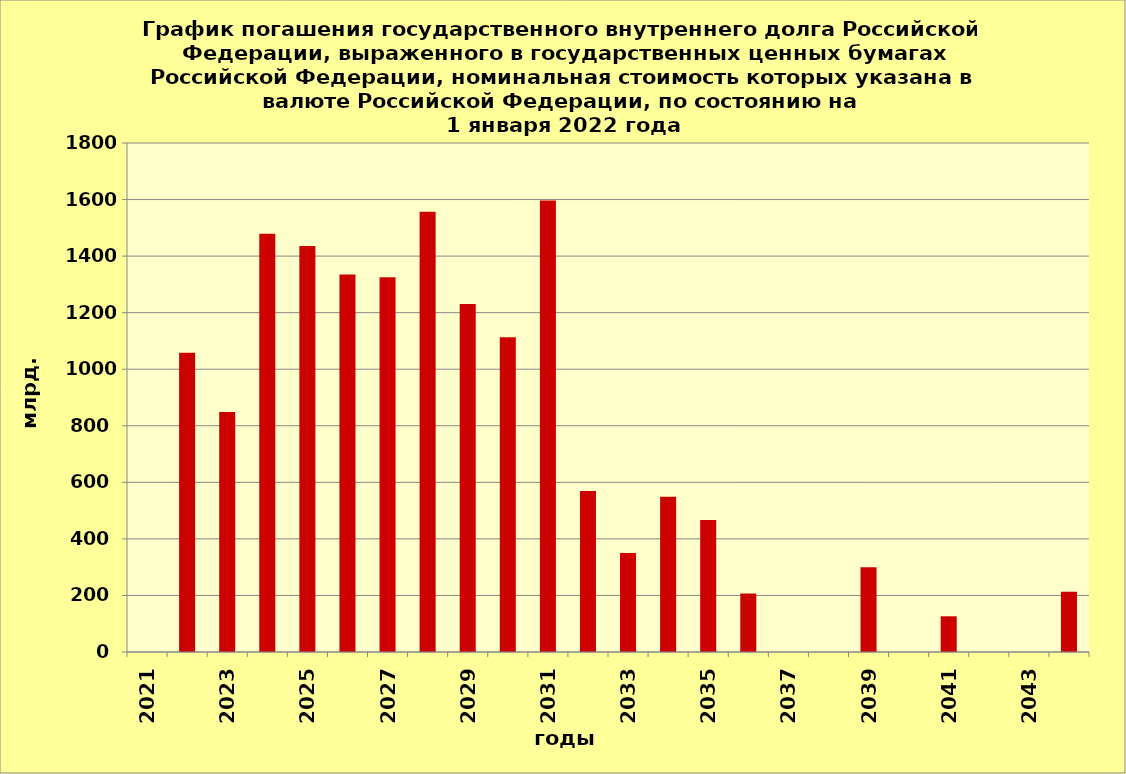
| Category | ряд 1 |
|---|---|
| 2021.0 | 0 |
| 2022.0 | 1057.917 |
| 2023.0 | 848.378 |
| 2024.0 | 1479.419 |
| 2025.0 | 1435.907 |
| 2026.0 | 1334.561 |
| 2027.0 | 1324.833 |
| 2028.0 | 1556.933 |
| 2029.0 | 1230.327 |
| 2030.0 | 1113.242 |
| 2031.0 | 1596.903 |
| 2032.0 | 569.425 |
| 2033.0 | 350 |
| 2034.0 | 548.84 |
| 2035.0 | 467.105 |
| 2036.0 | 207.155 |
| 2037.0 | 0 |
| 2038.0 | 0 |
| 2039.0 | 300 |
| 2040.0 | 0 |
| 2041.0 | 126.269 |
| 2042.0 | 0 |
| 2043.0 | 0 |
| 2044.0 | 212.636 |